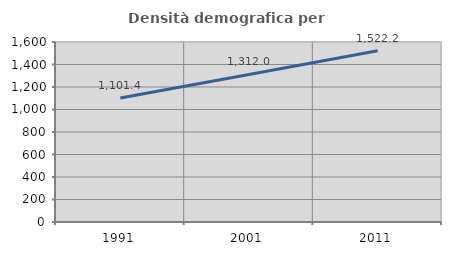
| Category | Densità demografica |
|---|---|
| 1991.0 | 1101.397 |
| 2001.0 | 1311.982 |
| 2011.0 | 1522.207 |